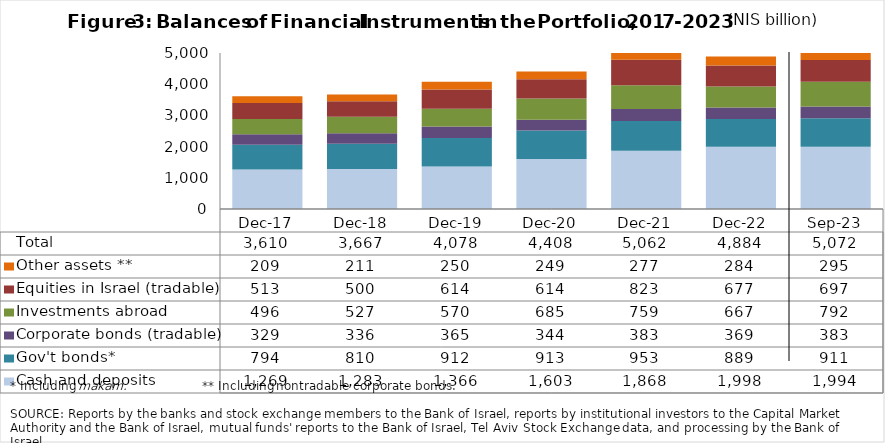
| Category | Cash and deposits | Gov't bonds* | Corporate bonds (tradable) | Investments abroad | Equities in Israel (tradable) | Other assets ** | Total |
|---|---|---|---|---|---|---|---|
| 2017-12-31 | 1268.97 | 793.97 | 329.2 | 496.34 | 512.85 | 209.04 | 3610.37 |
| 2018-12-31 | 1283.26 | 809.81 | 335.75 | 527.47 | 499.59 | 211.19 | 3667.07 |
| 2019-12-31 | 1365.73 | 911.91 | 365.33 | 570.44 | 614.38 | 249.97 | 4077.76 |
| 2020-12-31 | 1603.4 | 912.54 | 344.34 | 685.28 | 613.6 | 248.61 | 4407.77 |
| 2021-12-31 | 1867.92 | 952.58 | 383.05 | 759.49 | 822.75 | 276.62 | 5062.41 |
| 2022-12-31 | 1998.01 | 888.74 | 368.98 | 666.83 | 677.21 | 284.29 | 4884.06 |
| 2023-09-30 | 1994.15 | 910.55 | 383.11 | 791.93 | 696.84 | 295.12 | 5071.7 |